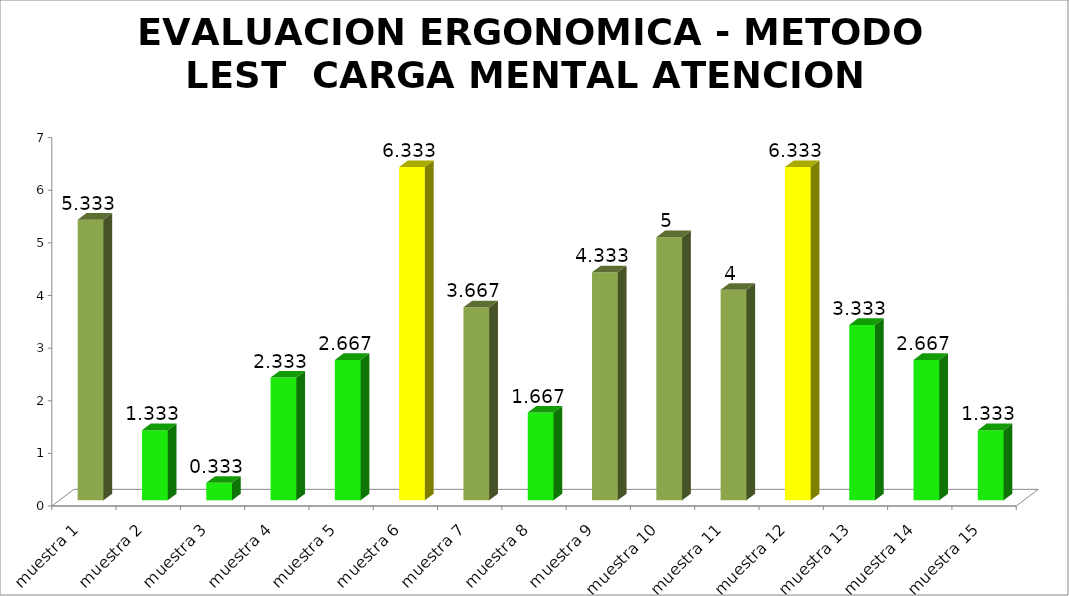
| Category | EVALUACION ERGONOMICA - METODO LEST  |
|---|---|
| muestra 1 | 5.333 |
| muestra 2 | 1.333 |
| muestra 3 | 0.333 |
| muestra 4 | 2.333 |
| muestra 5 | 2.667 |
| muestra 6 | 6.333 |
| muestra 7 | 3.667 |
| muestra 8 | 1.667 |
| muestra 9 | 4.333 |
| muestra 10 | 5 |
| muestra 11 | 4 |
| muestra 12 | 6.333 |
| muestra 13 | 3.333 |
| muestra 14 | 2.667 |
| muestra 15 | 1.333 |